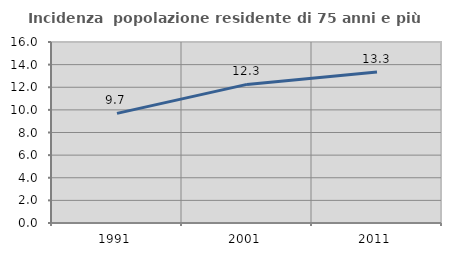
| Category | Incidenza  popolazione residente di 75 anni e più |
|---|---|
| 1991.0 | 9.69 |
| 2001.0 | 12.253 |
| 2011.0 | 13.344 |